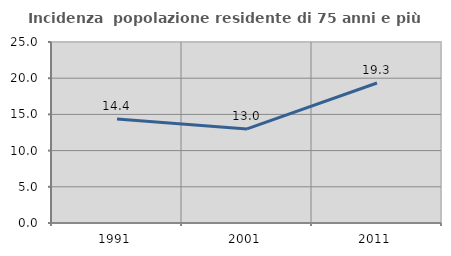
| Category | Incidenza  popolazione residente di 75 anni e più |
|---|---|
| 1991.0 | 14.356 |
| 2001.0 | 13 |
| 2011.0 | 19.34 |